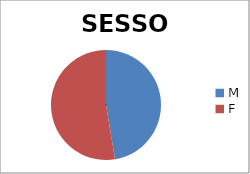
| Category | sesso |
|---|---|
| M | 47.368 |
| F | 52.632 |